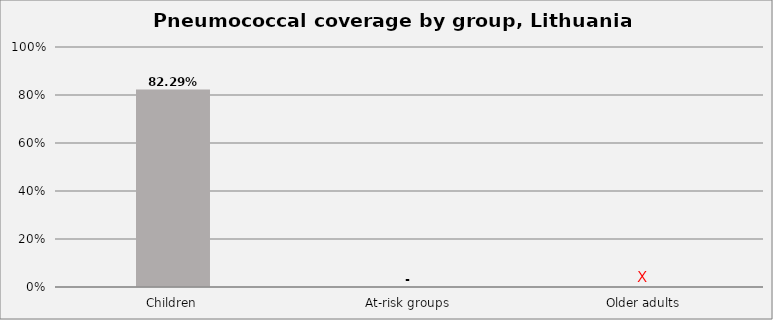
| Category | Series 0 |
|---|---|
| Children | 0.823 |
| At-risk groups | 0 |
| Older adults | 0 |